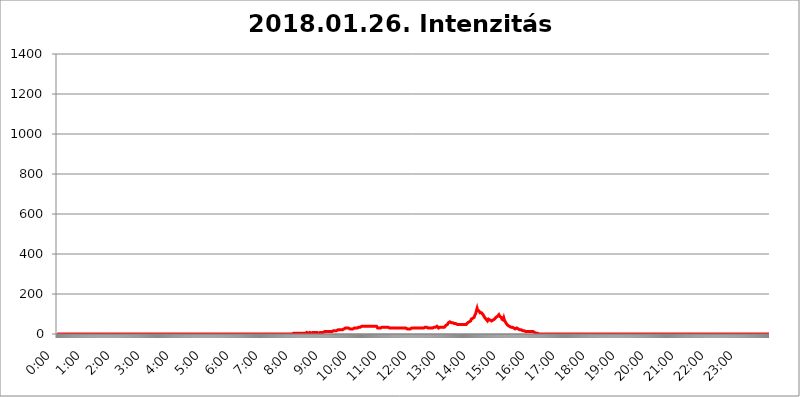
| Category | 2018.01.26. Intenzitás [W/m^2] |
|---|---|
| 0.0 | 0 |
| 0.0006944444444444445 | 0 |
| 0.001388888888888889 | 0 |
| 0.0020833333333333333 | 0 |
| 0.002777777777777778 | 0 |
| 0.003472222222222222 | 0 |
| 0.004166666666666667 | 0 |
| 0.004861111111111111 | 0 |
| 0.005555555555555556 | 0 |
| 0.0062499999999999995 | 0 |
| 0.006944444444444444 | 0 |
| 0.007638888888888889 | 0 |
| 0.008333333333333333 | 0 |
| 0.009027777777777779 | 0 |
| 0.009722222222222222 | 0 |
| 0.010416666666666666 | 0 |
| 0.011111111111111112 | 0 |
| 0.011805555555555555 | 0 |
| 0.012499999999999999 | 0 |
| 0.013194444444444444 | 0 |
| 0.013888888888888888 | 0 |
| 0.014583333333333332 | 0 |
| 0.015277777777777777 | 0 |
| 0.015972222222222224 | 0 |
| 0.016666666666666666 | 0 |
| 0.017361111111111112 | 0 |
| 0.018055555555555557 | 0 |
| 0.01875 | 0 |
| 0.019444444444444445 | 0 |
| 0.02013888888888889 | 0 |
| 0.020833333333333332 | 0 |
| 0.02152777777777778 | 0 |
| 0.022222222222222223 | 0 |
| 0.02291666666666667 | 0 |
| 0.02361111111111111 | 0 |
| 0.024305555555555556 | 0 |
| 0.024999999999999998 | 0 |
| 0.025694444444444447 | 0 |
| 0.02638888888888889 | 0 |
| 0.027083333333333334 | 0 |
| 0.027777777777777776 | 0 |
| 0.02847222222222222 | 0 |
| 0.029166666666666664 | 0 |
| 0.029861111111111113 | 0 |
| 0.030555555555555555 | 0 |
| 0.03125 | 0 |
| 0.03194444444444445 | 0 |
| 0.03263888888888889 | 0 |
| 0.03333333333333333 | 0 |
| 0.034027777777777775 | 0 |
| 0.034722222222222224 | 0 |
| 0.035416666666666666 | 0 |
| 0.036111111111111115 | 0 |
| 0.03680555555555556 | 0 |
| 0.0375 | 0 |
| 0.03819444444444444 | 0 |
| 0.03888888888888889 | 0 |
| 0.03958333333333333 | 0 |
| 0.04027777777777778 | 0 |
| 0.04097222222222222 | 0 |
| 0.041666666666666664 | 0 |
| 0.042361111111111106 | 0 |
| 0.04305555555555556 | 0 |
| 0.043750000000000004 | 0 |
| 0.044444444444444446 | 0 |
| 0.04513888888888889 | 0 |
| 0.04583333333333334 | 0 |
| 0.04652777777777778 | 0 |
| 0.04722222222222222 | 0 |
| 0.04791666666666666 | 0 |
| 0.04861111111111111 | 0 |
| 0.049305555555555554 | 0 |
| 0.049999999999999996 | 0 |
| 0.05069444444444445 | 0 |
| 0.051388888888888894 | 0 |
| 0.052083333333333336 | 0 |
| 0.05277777777777778 | 0 |
| 0.05347222222222222 | 0 |
| 0.05416666666666667 | 0 |
| 0.05486111111111111 | 0 |
| 0.05555555555555555 | 0 |
| 0.05625 | 0 |
| 0.05694444444444444 | 0 |
| 0.057638888888888885 | 0 |
| 0.05833333333333333 | 0 |
| 0.05902777777777778 | 0 |
| 0.059722222222222225 | 0 |
| 0.06041666666666667 | 0 |
| 0.061111111111111116 | 0 |
| 0.06180555555555556 | 0 |
| 0.0625 | 0 |
| 0.06319444444444444 | 0 |
| 0.06388888888888888 | 0 |
| 0.06458333333333334 | 0 |
| 0.06527777777777778 | 0 |
| 0.06597222222222222 | 0 |
| 0.06666666666666667 | 0 |
| 0.06736111111111111 | 0 |
| 0.06805555555555555 | 0 |
| 0.06874999999999999 | 0 |
| 0.06944444444444443 | 0 |
| 0.07013888888888889 | 0 |
| 0.07083333333333333 | 0 |
| 0.07152777777777779 | 0 |
| 0.07222222222222223 | 0 |
| 0.07291666666666667 | 0 |
| 0.07361111111111111 | 0 |
| 0.07430555555555556 | 0 |
| 0.075 | 0 |
| 0.07569444444444444 | 0 |
| 0.0763888888888889 | 0 |
| 0.07708333333333334 | 0 |
| 0.07777777777777778 | 0 |
| 0.07847222222222222 | 0 |
| 0.07916666666666666 | 0 |
| 0.0798611111111111 | 0 |
| 0.08055555555555556 | 0 |
| 0.08125 | 0 |
| 0.08194444444444444 | 0 |
| 0.08263888888888889 | 0 |
| 0.08333333333333333 | 0 |
| 0.08402777777777777 | 0 |
| 0.08472222222222221 | 0 |
| 0.08541666666666665 | 0 |
| 0.08611111111111112 | 0 |
| 0.08680555555555557 | 0 |
| 0.08750000000000001 | 0 |
| 0.08819444444444445 | 0 |
| 0.08888888888888889 | 0 |
| 0.08958333333333333 | 0 |
| 0.09027777777777778 | 0 |
| 0.09097222222222222 | 0 |
| 0.09166666666666667 | 0 |
| 0.09236111111111112 | 0 |
| 0.09305555555555556 | 0 |
| 0.09375 | 0 |
| 0.09444444444444444 | 0 |
| 0.09513888888888888 | 0 |
| 0.09583333333333333 | 0 |
| 0.09652777777777777 | 0 |
| 0.09722222222222222 | 0 |
| 0.09791666666666667 | 0 |
| 0.09861111111111111 | 0 |
| 0.09930555555555555 | 0 |
| 0.09999999999999999 | 0 |
| 0.10069444444444443 | 0 |
| 0.1013888888888889 | 0 |
| 0.10208333333333335 | 0 |
| 0.10277777777777779 | 0 |
| 0.10347222222222223 | 0 |
| 0.10416666666666667 | 0 |
| 0.10486111111111111 | 0 |
| 0.10555555555555556 | 0 |
| 0.10625 | 0 |
| 0.10694444444444444 | 0 |
| 0.1076388888888889 | 0 |
| 0.10833333333333334 | 0 |
| 0.10902777777777778 | 0 |
| 0.10972222222222222 | 0 |
| 0.1111111111111111 | 0 |
| 0.11180555555555556 | 0 |
| 0.11180555555555556 | 0 |
| 0.1125 | 0 |
| 0.11319444444444444 | 0 |
| 0.11388888888888889 | 0 |
| 0.11458333333333333 | 0 |
| 0.11527777777777777 | 0 |
| 0.11597222222222221 | 0 |
| 0.11666666666666665 | 0 |
| 0.1173611111111111 | 0 |
| 0.11805555555555557 | 0 |
| 0.11944444444444445 | 0 |
| 0.12013888888888889 | 0 |
| 0.12083333333333333 | 0 |
| 0.12152777777777778 | 0 |
| 0.12222222222222223 | 0 |
| 0.12291666666666667 | 0 |
| 0.12291666666666667 | 0 |
| 0.12361111111111112 | 0 |
| 0.12430555555555556 | 0 |
| 0.125 | 0 |
| 0.12569444444444444 | 0 |
| 0.12638888888888888 | 0 |
| 0.12708333333333333 | 0 |
| 0.16875 | 0 |
| 0.12847222222222224 | 0 |
| 0.12916666666666668 | 0 |
| 0.12986111111111112 | 0 |
| 0.13055555555555556 | 0 |
| 0.13125 | 0 |
| 0.13194444444444445 | 0 |
| 0.1326388888888889 | 0 |
| 0.13333333333333333 | 0 |
| 0.13402777777777777 | 0 |
| 0.13402777777777777 | 0 |
| 0.13472222222222222 | 0 |
| 0.13541666666666666 | 0 |
| 0.1361111111111111 | 0 |
| 0.13749999999999998 | 0 |
| 0.13819444444444443 | 0 |
| 0.1388888888888889 | 0 |
| 0.13958333333333334 | 0 |
| 0.14027777777777778 | 0 |
| 0.14097222222222222 | 0 |
| 0.14166666666666666 | 0 |
| 0.1423611111111111 | 0 |
| 0.14305555555555557 | 0 |
| 0.14375000000000002 | 0 |
| 0.14444444444444446 | 0 |
| 0.1451388888888889 | 0 |
| 0.1451388888888889 | 0 |
| 0.14652777777777778 | 0 |
| 0.14722222222222223 | 0 |
| 0.14791666666666667 | 0 |
| 0.1486111111111111 | 0 |
| 0.14930555555555555 | 0 |
| 0.15 | 0 |
| 0.15069444444444444 | 0 |
| 0.15138888888888888 | 0 |
| 0.15208333333333332 | 0 |
| 0.15277777777777776 | 0 |
| 0.15347222222222223 | 0 |
| 0.15416666666666667 | 0 |
| 0.15486111111111112 | 0 |
| 0.15555555555555556 | 0 |
| 0.15625 | 0 |
| 0.15694444444444444 | 0 |
| 0.15763888888888888 | 0 |
| 0.15833333333333333 | 0 |
| 0.15902777777777777 | 0 |
| 0.15972222222222224 | 0 |
| 0.16041666666666668 | 0 |
| 0.16111111111111112 | 0 |
| 0.16180555555555556 | 0 |
| 0.1625 | 0 |
| 0.16319444444444445 | 0 |
| 0.1638888888888889 | 0 |
| 0.16458333333333333 | 0 |
| 0.16527777777777777 | 0 |
| 0.16597222222222222 | 0 |
| 0.16666666666666666 | 0 |
| 0.1673611111111111 | 0 |
| 0.16805555555555554 | 0 |
| 0.16874999999999998 | 0 |
| 0.16944444444444443 | 0 |
| 0.17013888888888887 | 0 |
| 0.1708333333333333 | 0 |
| 0.17152777777777775 | 0 |
| 0.17222222222222225 | 0 |
| 0.1729166666666667 | 0 |
| 0.17361111111111113 | 0 |
| 0.17430555555555557 | 0 |
| 0.17500000000000002 | 0 |
| 0.17569444444444446 | 0 |
| 0.1763888888888889 | 0 |
| 0.17708333333333334 | 0 |
| 0.17777777777777778 | 0 |
| 0.17847222222222223 | 0 |
| 0.17916666666666667 | 0 |
| 0.1798611111111111 | 0 |
| 0.18055555555555555 | 0 |
| 0.18125 | 0 |
| 0.18194444444444444 | 0 |
| 0.1826388888888889 | 0 |
| 0.18333333333333335 | 0 |
| 0.1840277777777778 | 0 |
| 0.18472222222222223 | 0 |
| 0.18541666666666667 | 0 |
| 0.18611111111111112 | 0 |
| 0.18680555555555556 | 0 |
| 0.1875 | 0 |
| 0.18819444444444444 | 0 |
| 0.18888888888888888 | 0 |
| 0.18958333333333333 | 0 |
| 0.19027777777777777 | 0 |
| 0.1909722222222222 | 0 |
| 0.19166666666666665 | 0 |
| 0.19236111111111112 | 0 |
| 0.19305555555555554 | 0 |
| 0.19375 | 0 |
| 0.19444444444444445 | 0 |
| 0.1951388888888889 | 0 |
| 0.19583333333333333 | 0 |
| 0.19652777777777777 | 0 |
| 0.19722222222222222 | 0 |
| 0.19791666666666666 | 0 |
| 0.1986111111111111 | 0 |
| 0.19930555555555554 | 0 |
| 0.19999999999999998 | 0 |
| 0.20069444444444443 | 0 |
| 0.20138888888888887 | 0 |
| 0.2020833333333333 | 0 |
| 0.2027777777777778 | 0 |
| 0.2034722222222222 | 0 |
| 0.2041666666666667 | 0 |
| 0.20486111111111113 | 0 |
| 0.20555555555555557 | 0 |
| 0.20625000000000002 | 0 |
| 0.20694444444444446 | 0 |
| 0.2076388888888889 | 0 |
| 0.20833333333333334 | 0 |
| 0.20902777777777778 | 0 |
| 0.20972222222222223 | 0 |
| 0.21041666666666667 | 0 |
| 0.2111111111111111 | 0 |
| 0.21180555555555555 | 0 |
| 0.2125 | 0 |
| 0.21319444444444444 | 0 |
| 0.2138888888888889 | 0 |
| 0.21458333333333335 | 0 |
| 0.2152777777777778 | 0 |
| 0.21597222222222223 | 0 |
| 0.21666666666666667 | 0 |
| 0.21736111111111112 | 0 |
| 0.21805555555555556 | 0 |
| 0.21875 | 0 |
| 0.21944444444444444 | 0 |
| 0.22013888888888888 | 0 |
| 0.22083333333333333 | 0 |
| 0.22152777777777777 | 0 |
| 0.2222222222222222 | 0 |
| 0.22291666666666665 | 0 |
| 0.2236111111111111 | 0 |
| 0.22430555555555556 | 0 |
| 0.225 | 0 |
| 0.22569444444444445 | 0 |
| 0.2263888888888889 | 0 |
| 0.22708333333333333 | 0 |
| 0.22777777777777777 | 0 |
| 0.22847222222222222 | 0 |
| 0.22916666666666666 | 0 |
| 0.2298611111111111 | 0 |
| 0.23055555555555554 | 0 |
| 0.23124999999999998 | 0 |
| 0.23194444444444443 | 0 |
| 0.23263888888888887 | 0 |
| 0.2333333333333333 | 0 |
| 0.2340277777777778 | 0 |
| 0.2347222222222222 | 0 |
| 0.2354166666666667 | 0 |
| 0.23611111111111113 | 0 |
| 0.23680555555555557 | 0 |
| 0.23750000000000002 | 0 |
| 0.23819444444444446 | 0 |
| 0.2388888888888889 | 0 |
| 0.23958333333333334 | 0 |
| 0.24027777777777778 | 0 |
| 0.24097222222222223 | 0 |
| 0.24166666666666667 | 0 |
| 0.2423611111111111 | 0 |
| 0.24305555555555555 | 0 |
| 0.24375 | 0 |
| 0.24444444444444446 | 0 |
| 0.24513888888888888 | 0 |
| 0.24583333333333335 | 0 |
| 0.2465277777777778 | 0 |
| 0.24722222222222223 | 0 |
| 0.24791666666666667 | 0 |
| 0.24861111111111112 | 0 |
| 0.24930555555555556 | 0 |
| 0.25 | 0 |
| 0.25069444444444444 | 0 |
| 0.2513888888888889 | 0 |
| 0.2520833333333333 | 0 |
| 0.25277777777777777 | 0 |
| 0.2534722222222222 | 0 |
| 0.25416666666666665 | 0 |
| 0.2548611111111111 | 0 |
| 0.2555555555555556 | 0 |
| 0.25625000000000003 | 0 |
| 0.2569444444444445 | 0 |
| 0.2576388888888889 | 0 |
| 0.25833333333333336 | 0 |
| 0.2590277777777778 | 0 |
| 0.25972222222222224 | 0 |
| 0.2604166666666667 | 0 |
| 0.2611111111111111 | 0 |
| 0.26180555555555557 | 0 |
| 0.2625 | 0 |
| 0.26319444444444445 | 0 |
| 0.2638888888888889 | 0 |
| 0.26458333333333334 | 0 |
| 0.2652777777777778 | 0 |
| 0.2659722222222222 | 0 |
| 0.26666666666666666 | 0 |
| 0.2673611111111111 | 0 |
| 0.26805555555555555 | 0 |
| 0.26875 | 0 |
| 0.26944444444444443 | 0 |
| 0.2701388888888889 | 0 |
| 0.2708333333333333 | 0 |
| 0.27152777777777776 | 0 |
| 0.2722222222222222 | 0 |
| 0.27291666666666664 | 0 |
| 0.2736111111111111 | 0 |
| 0.2743055555555555 | 0 |
| 0.27499999999999997 | 0 |
| 0.27569444444444446 | 0 |
| 0.27638888888888885 | 0 |
| 0.27708333333333335 | 0 |
| 0.2777777777777778 | 0 |
| 0.27847222222222223 | 0 |
| 0.2791666666666667 | 0 |
| 0.2798611111111111 | 0 |
| 0.28055555555555556 | 0 |
| 0.28125 | 0 |
| 0.28194444444444444 | 0 |
| 0.2826388888888889 | 0 |
| 0.2833333333333333 | 0 |
| 0.28402777777777777 | 0 |
| 0.2847222222222222 | 0 |
| 0.28541666666666665 | 0 |
| 0.28611111111111115 | 0 |
| 0.28680555555555554 | 0 |
| 0.28750000000000003 | 0 |
| 0.2881944444444445 | 0 |
| 0.2888888888888889 | 0 |
| 0.28958333333333336 | 0 |
| 0.2902777777777778 | 0 |
| 0.29097222222222224 | 0 |
| 0.2916666666666667 | 0 |
| 0.2923611111111111 | 0 |
| 0.29305555555555557 | 0 |
| 0.29375 | 0 |
| 0.29444444444444445 | 0 |
| 0.2951388888888889 | 0 |
| 0.29583333333333334 | 0 |
| 0.2965277777777778 | 0 |
| 0.2972222222222222 | 0 |
| 0.29791666666666666 | 0 |
| 0.2986111111111111 | 0 |
| 0.29930555555555555 | 0 |
| 0.3 | 0 |
| 0.30069444444444443 | 0 |
| 0.3013888888888889 | 0 |
| 0.3020833333333333 | 0 |
| 0.30277777777777776 | 0 |
| 0.3034722222222222 | 0 |
| 0.30416666666666664 | 0 |
| 0.3048611111111111 | 0 |
| 0.3055555555555555 | 0 |
| 0.30624999999999997 | 0 |
| 0.3069444444444444 | 0 |
| 0.3076388888888889 | 0 |
| 0.30833333333333335 | 0 |
| 0.3090277777777778 | 0 |
| 0.30972222222222223 | 0 |
| 0.3104166666666667 | 0 |
| 0.3111111111111111 | 0 |
| 0.31180555555555556 | 0 |
| 0.3125 | 0 |
| 0.31319444444444444 | 0 |
| 0.3138888888888889 | 0 |
| 0.3145833333333333 | 0 |
| 0.31527777777777777 | 0 |
| 0.3159722222222222 | 0 |
| 0.31666666666666665 | 0 |
| 0.31736111111111115 | 0 |
| 0.31805555555555554 | 0 |
| 0.31875000000000003 | 0 |
| 0.3194444444444445 | 0 |
| 0.3201388888888889 | 3.525 |
| 0.32083333333333336 | 0 |
| 0.3215277777777778 | 0 |
| 0.32222222222222224 | 0 |
| 0.3229166666666667 | 0 |
| 0.3236111111111111 | 0 |
| 0.32430555555555557 | 0 |
| 0.325 | 0 |
| 0.32569444444444445 | 0 |
| 0.3263888888888889 | 0 |
| 0.32708333333333334 | 0 |
| 0.3277777777777778 | 0 |
| 0.3284722222222222 | 0 |
| 0.32916666666666666 | 0 |
| 0.3298611111111111 | 3.525 |
| 0.33055555555555555 | 3.525 |
| 0.33125 | 3.525 |
| 0.33194444444444443 | 3.525 |
| 0.3326388888888889 | 3.525 |
| 0.3333333333333333 | 3.525 |
| 0.3340277777777778 | 3.525 |
| 0.3347222222222222 | 3.525 |
| 0.3354166666666667 | 3.525 |
| 0.3361111111111111 | 3.525 |
| 0.3368055555555556 | 3.525 |
| 0.33749999999999997 | 3.525 |
| 0.33819444444444446 | 3.525 |
| 0.33888888888888885 | 3.525 |
| 0.33958333333333335 | 3.525 |
| 0.34027777777777773 | 3.525 |
| 0.34097222222222223 | 3.525 |
| 0.3416666666666666 | 3.525 |
| 0.3423611111111111 | 3.525 |
| 0.3430555555555555 | 3.525 |
| 0.34375 | 3.525 |
| 0.3444444444444445 | 3.525 |
| 0.3451388888888889 | 3.525 |
| 0.3458333333333334 | 3.525 |
| 0.34652777777777777 | 3.525 |
| 0.34722222222222227 | 3.525 |
| 0.34791666666666665 | 3.525 |
| 0.34861111111111115 | 3.525 |
| 0.34930555555555554 | 3.525 |
| 0.35000000000000003 | 7.887 |
| 0.3506944444444444 | 7.887 |
| 0.3513888888888889 | 7.887 |
| 0.3520833333333333 | 3.525 |
| 0.3527777777777778 | 7.887 |
| 0.3534722222222222 | 3.525 |
| 0.3541666666666667 | 7.887 |
| 0.3548611111111111 | 3.525 |
| 0.35555555555555557 | 3.525 |
| 0.35625 | 3.525 |
| 0.35694444444444445 | 7.887 |
| 0.3576388888888889 | 7.887 |
| 0.35833333333333334 | 7.887 |
| 0.3590277777777778 | 7.887 |
| 0.3597222222222222 | 7.887 |
| 0.36041666666666666 | 7.887 |
| 0.3611111111111111 | 7.887 |
| 0.36180555555555555 | 7.887 |
| 0.3625 | 7.887 |
| 0.36319444444444443 | 7.887 |
| 0.3638888888888889 | 7.887 |
| 0.3645833333333333 | 7.887 |
| 0.3652777777777778 | 7.887 |
| 0.3659722222222222 | 3.525 |
| 0.3666666666666667 | 3.525 |
| 0.3673611111111111 | 3.525 |
| 0.3680555555555556 | 3.525 |
| 0.36874999999999997 | 7.887 |
| 0.36944444444444446 | 7.887 |
| 0.37013888888888885 | 7.887 |
| 0.37083333333333335 | 7.887 |
| 0.37152777777777773 | 7.887 |
| 0.37222222222222223 | 7.887 |
| 0.3729166666666666 | 7.887 |
| 0.3736111111111111 | 7.887 |
| 0.3743055555555555 | 12.257 |
| 0.375 | 12.257 |
| 0.3756944444444445 | 12.257 |
| 0.3763888888888889 | 12.257 |
| 0.3770833333333334 | 12.257 |
| 0.37777777777777777 | 12.257 |
| 0.37847222222222227 | 12.257 |
| 0.37916666666666665 | 12.257 |
| 0.37986111111111115 | 12.257 |
| 0.38055555555555554 | 12.257 |
| 0.38125000000000003 | 12.257 |
| 0.3819444444444444 | 12.257 |
| 0.3826388888888889 | 12.257 |
| 0.3833333333333333 | 12.257 |
| 0.3840277777777778 | 12.257 |
| 0.3847222222222222 | 12.257 |
| 0.3854166666666667 | 12.257 |
| 0.3861111111111111 | 12.257 |
| 0.38680555555555557 | 12.257 |
| 0.3875 | 16.636 |
| 0.38819444444444445 | 16.636 |
| 0.3888888888888889 | 16.636 |
| 0.38958333333333334 | 16.636 |
| 0.3902777777777778 | 16.636 |
| 0.3909722222222222 | 16.636 |
| 0.39166666666666666 | 16.636 |
| 0.3923611111111111 | 16.636 |
| 0.39305555555555555 | 16.636 |
| 0.39375 | 21.024 |
| 0.39444444444444443 | 21.024 |
| 0.3951388888888889 | 21.024 |
| 0.3958333333333333 | 21.024 |
| 0.3965277777777778 | 21.024 |
| 0.3972222222222222 | 21.024 |
| 0.3979166666666667 | 21.024 |
| 0.3986111111111111 | 21.024 |
| 0.3993055555555556 | 21.024 |
| 0.39999999999999997 | 21.024 |
| 0.40069444444444446 | 21.024 |
| 0.40138888888888885 | 25.419 |
| 0.40208333333333335 | 25.419 |
| 0.40277777777777773 | 29.823 |
| 0.40347222222222223 | 29.823 |
| 0.4041666666666666 | 29.823 |
| 0.4048611111111111 | 29.823 |
| 0.4055555555555555 | 29.823 |
| 0.40625 | 29.823 |
| 0.4069444444444445 | 29.823 |
| 0.4076388888888889 | 29.823 |
| 0.4083333333333334 | 29.823 |
| 0.40902777777777777 | 25.419 |
| 0.40972222222222227 | 25.419 |
| 0.41041666666666665 | 25.419 |
| 0.41111111111111115 | 25.419 |
| 0.41180555555555554 | 25.419 |
| 0.41250000000000003 | 25.419 |
| 0.4131944444444444 | 25.419 |
| 0.4138888888888889 | 25.419 |
| 0.4145833333333333 | 25.419 |
| 0.4152777777777778 | 25.419 |
| 0.4159722222222222 | 25.419 |
| 0.4166666666666667 | 29.823 |
| 0.4173611111111111 | 29.823 |
| 0.41805555555555557 | 29.823 |
| 0.41875 | 29.823 |
| 0.41944444444444445 | 29.823 |
| 0.4201388888888889 | 29.823 |
| 0.42083333333333334 | 29.823 |
| 0.4215277777777778 | 29.823 |
| 0.4222222222222222 | 34.234 |
| 0.42291666666666666 | 34.234 |
| 0.4236111111111111 | 34.234 |
| 0.42430555555555555 | 34.234 |
| 0.425 | 34.234 |
| 0.42569444444444443 | 38.653 |
| 0.4263888888888889 | 38.653 |
| 0.4270833333333333 | 38.653 |
| 0.4277777777777778 | 38.653 |
| 0.4284722222222222 | 38.653 |
| 0.4291666666666667 | 38.653 |
| 0.4298611111111111 | 38.653 |
| 0.4305555555555556 | 38.653 |
| 0.43124999999999997 | 38.653 |
| 0.43194444444444446 | 38.653 |
| 0.43263888888888885 | 38.653 |
| 0.43333333333333335 | 38.653 |
| 0.43402777777777773 | 38.653 |
| 0.43472222222222223 | 38.653 |
| 0.4354166666666666 | 38.653 |
| 0.4361111111111111 | 38.653 |
| 0.4368055555555555 | 38.653 |
| 0.4375 | 38.653 |
| 0.4381944444444445 | 38.653 |
| 0.4388888888888889 | 38.653 |
| 0.4395833333333334 | 38.653 |
| 0.44027777777777777 | 38.653 |
| 0.44097222222222227 | 38.653 |
| 0.44166666666666665 | 38.653 |
| 0.44236111111111115 | 38.653 |
| 0.44305555555555554 | 38.653 |
| 0.44375000000000003 | 38.653 |
| 0.4444444444444444 | 38.653 |
| 0.4451388888888889 | 38.653 |
| 0.4458333333333333 | 38.653 |
| 0.4465277777777778 | 38.653 |
| 0.4472222222222222 | 38.653 |
| 0.4479166666666667 | 38.653 |
| 0.4486111111111111 | 38.653 |
| 0.44930555555555557 | 29.823 |
| 0.45 | 29.823 |
| 0.45069444444444445 | 29.823 |
| 0.4513888888888889 | 29.823 |
| 0.45208333333333334 | 34.234 |
| 0.4527777777777778 | 34.234 |
| 0.4534722222222222 | 29.823 |
| 0.45416666666666666 | 34.234 |
| 0.4548611111111111 | 34.234 |
| 0.45555555555555555 | 34.234 |
| 0.45625 | 34.234 |
| 0.45694444444444443 | 34.234 |
| 0.4576388888888889 | 34.234 |
| 0.4583333333333333 | 34.234 |
| 0.4590277777777778 | 34.234 |
| 0.4597222222222222 | 34.234 |
| 0.4604166666666667 | 34.234 |
| 0.4611111111111111 | 34.234 |
| 0.4618055555555556 | 34.234 |
| 0.46249999999999997 | 34.234 |
| 0.46319444444444446 | 34.234 |
| 0.46388888888888885 | 34.234 |
| 0.46458333333333335 | 34.234 |
| 0.46527777777777773 | 29.823 |
| 0.46597222222222223 | 29.823 |
| 0.4666666666666666 | 29.823 |
| 0.4673611111111111 | 29.823 |
| 0.4680555555555555 | 29.823 |
| 0.46875 | 29.823 |
| 0.4694444444444445 | 29.823 |
| 0.4701388888888889 | 29.823 |
| 0.4708333333333334 | 29.823 |
| 0.47152777777777777 | 29.823 |
| 0.47222222222222227 | 29.823 |
| 0.47291666666666665 | 29.823 |
| 0.47361111111111115 | 29.823 |
| 0.47430555555555554 | 29.823 |
| 0.47500000000000003 | 29.823 |
| 0.4756944444444444 | 29.823 |
| 0.4763888888888889 | 29.823 |
| 0.4770833333333333 | 29.823 |
| 0.4777777777777778 | 29.823 |
| 0.4784722222222222 | 29.823 |
| 0.4791666666666667 | 29.823 |
| 0.4798611111111111 | 29.823 |
| 0.48055555555555557 | 29.823 |
| 0.48125 | 29.823 |
| 0.48194444444444445 | 29.823 |
| 0.4826388888888889 | 29.823 |
| 0.48333333333333334 | 29.823 |
| 0.4840277777777778 | 29.823 |
| 0.4847222222222222 | 29.823 |
| 0.48541666666666666 | 29.823 |
| 0.4861111111111111 | 29.823 |
| 0.48680555555555555 | 29.823 |
| 0.4875 | 29.823 |
| 0.48819444444444443 | 29.823 |
| 0.4888888888888889 | 29.823 |
| 0.4895833333333333 | 29.823 |
| 0.4902777777777778 | 29.823 |
| 0.4909722222222222 | 25.419 |
| 0.4916666666666667 | 25.419 |
| 0.4923611111111111 | 25.419 |
| 0.4930555555555556 | 25.419 |
| 0.49374999999999997 | 25.419 |
| 0.49444444444444446 | 25.419 |
| 0.49513888888888885 | 25.419 |
| 0.49583333333333335 | 29.823 |
| 0.49652777777777773 | 29.823 |
| 0.49722222222222223 | 29.823 |
| 0.4979166666666666 | 29.823 |
| 0.4986111111111111 | 29.823 |
| 0.4993055555555555 | 29.823 |
| 0.5 | 29.823 |
| 0.5006944444444444 | 29.823 |
| 0.5013888888888889 | 29.823 |
| 0.5020833333333333 | 29.823 |
| 0.5027777777777778 | 29.823 |
| 0.5034722222222222 | 29.823 |
| 0.5041666666666667 | 29.823 |
| 0.5048611111111111 | 29.823 |
| 0.5055555555555555 | 29.823 |
| 0.50625 | 29.823 |
| 0.5069444444444444 | 29.823 |
| 0.5076388888888889 | 29.823 |
| 0.5083333333333333 | 29.823 |
| 0.5090277777777777 | 29.823 |
| 0.5097222222222222 | 29.823 |
| 0.5104166666666666 | 29.823 |
| 0.5111111111111112 | 29.823 |
| 0.5118055555555555 | 29.823 |
| 0.5125000000000001 | 29.823 |
| 0.5131944444444444 | 29.823 |
| 0.513888888888889 | 29.823 |
| 0.5145833333333333 | 34.234 |
| 0.5152777777777778 | 34.234 |
| 0.5159722222222222 | 34.234 |
| 0.5166666666666667 | 29.823 |
| 0.517361111111111 | 34.234 |
| 0.5180555555555556 | 34.234 |
| 0.5187499999999999 | 34.234 |
| 0.5194444444444445 | 29.823 |
| 0.5201388888888888 | 29.823 |
| 0.5208333333333334 | 29.823 |
| 0.5215277777777778 | 29.823 |
| 0.5222222222222223 | 29.823 |
| 0.5229166666666667 | 29.823 |
| 0.5236111111111111 | 29.823 |
| 0.5243055555555556 | 29.823 |
| 0.525 | 29.823 |
| 0.5256944444444445 | 29.823 |
| 0.5263888888888889 | 29.823 |
| 0.5270833333333333 | 29.823 |
| 0.5277777777777778 | 34.234 |
| 0.5284722222222222 | 34.234 |
| 0.5291666666666667 | 34.234 |
| 0.5298611111111111 | 34.234 |
| 0.5305555555555556 | 34.234 |
| 0.53125 | 38.653 |
| 0.5319444444444444 | 38.653 |
| 0.5326388888888889 | 38.653 |
| 0.5333333333333333 | 34.234 |
| 0.5340277777777778 | 34.234 |
| 0.5347222222222222 | 29.823 |
| 0.5354166666666667 | 34.234 |
| 0.5361111111111111 | 34.234 |
| 0.5368055555555555 | 34.234 |
| 0.5375 | 34.234 |
| 0.5381944444444444 | 34.234 |
| 0.5388888888888889 | 34.234 |
| 0.5395833333333333 | 34.234 |
| 0.5402777777777777 | 34.234 |
| 0.5409722222222222 | 34.234 |
| 0.5416666666666666 | 34.234 |
| 0.5423611111111112 | 34.234 |
| 0.5430555555555555 | 34.234 |
| 0.5437500000000001 | 38.653 |
| 0.5444444444444444 | 38.653 |
| 0.545138888888889 | 43.079 |
| 0.5458333333333333 | 43.079 |
| 0.5465277777777778 | 47.511 |
| 0.5472222222222222 | 47.511 |
| 0.5479166666666667 | 51.951 |
| 0.548611111111111 | 56.398 |
| 0.5493055555555556 | 60.85 |
| 0.5499999999999999 | 60.85 |
| 0.5506944444444445 | 60.85 |
| 0.5513888888888888 | 60.85 |
| 0.5520833333333334 | 60.85 |
| 0.5527777777777778 | 56.398 |
| 0.5534722222222223 | 51.951 |
| 0.5541666666666667 | 56.398 |
| 0.5548611111111111 | 56.398 |
| 0.5555555555555556 | 56.398 |
| 0.55625 | 56.398 |
| 0.5569444444444445 | 51.951 |
| 0.5576388888888889 | 56.398 |
| 0.5583333333333333 | 56.398 |
| 0.5590277777777778 | 51.951 |
| 0.5597222222222222 | 51.951 |
| 0.5604166666666667 | 51.951 |
| 0.5611111111111111 | 47.511 |
| 0.5618055555555556 | 47.511 |
| 0.5625 | 47.511 |
| 0.5631944444444444 | 47.511 |
| 0.5638888888888889 | 47.511 |
| 0.5645833333333333 | 47.511 |
| 0.5652777777777778 | 47.511 |
| 0.5659722222222222 | 47.511 |
| 0.5666666666666667 | 47.511 |
| 0.5673611111111111 | 47.511 |
| 0.5680555555555555 | 47.511 |
| 0.56875 | 47.511 |
| 0.5694444444444444 | 47.511 |
| 0.5701388888888889 | 47.511 |
| 0.5708333333333333 | 47.511 |
| 0.5715277777777777 | 47.511 |
| 0.5722222222222222 | 47.511 |
| 0.5729166666666666 | 47.511 |
| 0.5736111111111112 | 47.511 |
| 0.5743055555555555 | 51.951 |
| 0.5750000000000001 | 51.951 |
| 0.5756944444444444 | 56.398 |
| 0.576388888888889 | 56.398 |
| 0.5770833333333333 | 60.85 |
| 0.5777777777777778 | 60.85 |
| 0.5784722222222222 | 65.31 |
| 0.5791666666666667 | 65.31 |
| 0.579861111111111 | 65.31 |
| 0.5805555555555556 | 74.246 |
| 0.5812499999999999 | 78.722 |
| 0.5819444444444445 | 78.722 |
| 0.5826388888888888 | 78.722 |
| 0.5833333333333334 | 78.722 |
| 0.5840277777777778 | 78.722 |
| 0.5847222222222223 | 83.205 |
| 0.5854166666666667 | 92.184 |
| 0.5861111111111111 | 92.184 |
| 0.5868055555555556 | 101.184 |
| 0.5875 | 110.201 |
| 0.5881944444444445 | 119.235 |
| 0.5888888888888889 | 128.284 |
| 0.5895833333333333 | 119.235 |
| 0.5902777777777778 | 114.716 |
| 0.5909722222222222 | 119.235 |
| 0.5916666666666667 | 114.716 |
| 0.5923611111111111 | 110.201 |
| 0.5930555555555556 | 105.69 |
| 0.59375 | 105.69 |
| 0.5944444444444444 | 105.69 |
| 0.5951388888888889 | 105.69 |
| 0.5958333333333333 | 105.69 |
| 0.5965277777777778 | 101.184 |
| 0.5972222222222222 | 96.682 |
| 0.5979166666666667 | 92.184 |
| 0.5986111111111111 | 92.184 |
| 0.5993055555555555 | 83.205 |
| 0.6 | 83.205 |
| 0.6006944444444444 | 78.722 |
| 0.6013888888888889 | 74.246 |
| 0.6020833333333333 | 69.775 |
| 0.6027777777777777 | 69.775 |
| 0.6034722222222222 | 65.31 |
| 0.6041666666666666 | 69.775 |
| 0.6048611111111112 | 74.246 |
| 0.6055555555555555 | 78.722 |
| 0.6062500000000001 | 74.246 |
| 0.6069444444444444 | 69.775 |
| 0.607638888888889 | 65.31 |
| 0.6083333333333333 | 65.31 |
| 0.6090277777777778 | 65.31 |
| 0.6097222222222222 | 65.31 |
| 0.6104166666666667 | 65.31 |
| 0.611111111111111 | 69.775 |
| 0.6118055555555556 | 69.775 |
| 0.6124999999999999 | 69.775 |
| 0.6131944444444445 | 74.246 |
| 0.6138888888888888 | 74.246 |
| 0.6145833333333334 | 78.722 |
| 0.6152777777777778 | 83.205 |
| 0.6159722222222223 | 83.205 |
| 0.6166666666666667 | 83.205 |
| 0.6173611111111111 | 87.692 |
| 0.6180555555555556 | 92.184 |
| 0.61875 | 92.184 |
| 0.6194444444444445 | 96.682 |
| 0.6201388888888889 | 96.682 |
| 0.6208333333333333 | 87.692 |
| 0.6215277777777778 | 83.205 |
| 0.6222222222222222 | 83.205 |
| 0.6229166666666667 | 83.205 |
| 0.6236111111111111 | 74.246 |
| 0.6243055555555556 | 74.246 |
| 0.625 | 69.775 |
| 0.6256944444444444 | 69.775 |
| 0.6263888888888889 | 78.722 |
| 0.6270833333333333 | 69.775 |
| 0.6277777777777778 | 65.31 |
| 0.6284722222222222 | 60.85 |
| 0.6291666666666667 | 56.398 |
| 0.6298611111111111 | 51.951 |
| 0.6305555555555555 | 51.951 |
| 0.63125 | 47.511 |
| 0.6319444444444444 | 43.079 |
| 0.6326388888888889 | 43.079 |
| 0.6333333333333333 | 38.653 |
| 0.6340277777777777 | 38.653 |
| 0.6347222222222222 | 38.653 |
| 0.6354166666666666 | 38.653 |
| 0.6361111111111112 | 34.234 |
| 0.6368055555555555 | 38.653 |
| 0.6375000000000001 | 34.234 |
| 0.6381944444444444 | 34.234 |
| 0.638888888888889 | 34.234 |
| 0.6395833333333333 | 29.823 |
| 0.6402777777777778 | 29.823 |
| 0.6409722222222222 | 29.823 |
| 0.6416666666666667 | 29.823 |
| 0.642361111111111 | 25.419 |
| 0.6430555555555556 | 25.419 |
| 0.6437499999999999 | 25.419 |
| 0.6444444444444445 | 29.823 |
| 0.6451388888888888 | 29.823 |
| 0.6458333333333334 | 29.823 |
| 0.6465277777777778 | 25.419 |
| 0.6472222222222223 | 25.419 |
| 0.6479166666666667 | 21.024 |
| 0.6486111111111111 | 21.024 |
| 0.6493055555555556 | 21.024 |
| 0.65 | 21.024 |
| 0.6506944444444445 | 21.024 |
| 0.6513888888888889 | 21.024 |
| 0.6520833333333333 | 16.636 |
| 0.6527777777777778 | 16.636 |
| 0.6534722222222222 | 16.636 |
| 0.6541666666666667 | 16.636 |
| 0.6548611111111111 | 16.636 |
| 0.6555555555555556 | 12.257 |
| 0.65625 | 12.257 |
| 0.6569444444444444 | 12.257 |
| 0.6576388888888889 | 12.257 |
| 0.6583333333333333 | 12.257 |
| 0.6590277777777778 | 12.257 |
| 0.6597222222222222 | 12.257 |
| 0.6604166666666667 | 12.257 |
| 0.6611111111111111 | 12.257 |
| 0.6618055555555555 | 12.257 |
| 0.6625 | 12.257 |
| 0.6631944444444444 | 12.257 |
| 0.6638888888888889 | 12.257 |
| 0.6645833333333333 | 12.257 |
| 0.6652777777777777 | 12.257 |
| 0.6659722222222222 | 12.257 |
| 0.6666666666666666 | 12.257 |
| 0.6673611111111111 | 12.257 |
| 0.6680555555555556 | 7.887 |
| 0.6687500000000001 | 7.887 |
| 0.6694444444444444 | 7.887 |
| 0.6701388888888888 | 3.525 |
| 0.6708333333333334 | 3.525 |
| 0.6715277777777778 | 3.525 |
| 0.6722222222222222 | 3.525 |
| 0.6729166666666666 | 3.525 |
| 0.6736111111111112 | 3.525 |
| 0.6743055555555556 | 3.525 |
| 0.6749999999999999 | 3.525 |
| 0.6756944444444444 | 0 |
| 0.6763888888888889 | 0 |
| 0.6770833333333334 | 0 |
| 0.6777777777777777 | 0 |
| 0.6784722222222223 | 0 |
| 0.6791666666666667 | 0 |
| 0.6798611111111111 | 0 |
| 0.6805555555555555 | 0 |
| 0.68125 | 0 |
| 0.6819444444444445 | 0 |
| 0.6826388888888889 | 0 |
| 0.6833333333333332 | 0 |
| 0.6840277777777778 | 0 |
| 0.6847222222222222 | 0 |
| 0.6854166666666667 | 0 |
| 0.686111111111111 | 0 |
| 0.6868055555555556 | 0 |
| 0.6875 | 0 |
| 0.6881944444444444 | 0 |
| 0.688888888888889 | 0 |
| 0.6895833333333333 | 0 |
| 0.6902777777777778 | 0 |
| 0.6909722222222222 | 0 |
| 0.6916666666666668 | 0 |
| 0.6923611111111111 | 0 |
| 0.6930555555555555 | 0 |
| 0.69375 | 0 |
| 0.6944444444444445 | 0 |
| 0.6951388888888889 | 0 |
| 0.6958333333333333 | 0 |
| 0.6965277777777777 | 0 |
| 0.6972222222222223 | 0 |
| 0.6979166666666666 | 0 |
| 0.6986111111111111 | 0 |
| 0.6993055555555556 | 0 |
| 0.7000000000000001 | 0 |
| 0.7006944444444444 | 0 |
| 0.7013888888888888 | 0 |
| 0.7020833333333334 | 0 |
| 0.7027777777777778 | 0 |
| 0.7034722222222222 | 0 |
| 0.7041666666666666 | 0 |
| 0.7048611111111112 | 0 |
| 0.7055555555555556 | 0 |
| 0.7062499999999999 | 0 |
| 0.7069444444444444 | 0 |
| 0.7076388888888889 | 0 |
| 0.7083333333333334 | 0 |
| 0.7090277777777777 | 0 |
| 0.7097222222222223 | 0 |
| 0.7104166666666667 | 0 |
| 0.7111111111111111 | 0 |
| 0.7118055555555555 | 0 |
| 0.7125 | 0 |
| 0.7131944444444445 | 0 |
| 0.7138888888888889 | 0 |
| 0.7145833333333332 | 0 |
| 0.7152777777777778 | 0 |
| 0.7159722222222222 | 0 |
| 0.7166666666666667 | 0 |
| 0.717361111111111 | 0 |
| 0.7180555555555556 | 0 |
| 0.71875 | 0 |
| 0.7194444444444444 | 0 |
| 0.720138888888889 | 0 |
| 0.7208333333333333 | 0 |
| 0.7215277777777778 | 0 |
| 0.7222222222222222 | 0 |
| 0.7229166666666668 | 0 |
| 0.7236111111111111 | 0 |
| 0.7243055555555555 | 0 |
| 0.725 | 0 |
| 0.7256944444444445 | 0 |
| 0.7263888888888889 | 0 |
| 0.7270833333333333 | 0 |
| 0.7277777777777777 | 0 |
| 0.7284722222222223 | 0 |
| 0.7291666666666666 | 0 |
| 0.7298611111111111 | 0 |
| 0.7305555555555556 | 0 |
| 0.7312500000000001 | 0 |
| 0.7319444444444444 | 0 |
| 0.7326388888888888 | 0 |
| 0.7333333333333334 | 0 |
| 0.7340277777777778 | 0 |
| 0.7347222222222222 | 0 |
| 0.7354166666666666 | 0 |
| 0.7361111111111112 | 0 |
| 0.7368055555555556 | 0 |
| 0.7374999999999999 | 0 |
| 0.7381944444444444 | 0 |
| 0.7388888888888889 | 0 |
| 0.7395833333333334 | 0 |
| 0.7402777777777777 | 0 |
| 0.7409722222222223 | 0 |
| 0.7416666666666667 | 0 |
| 0.7423611111111111 | 0 |
| 0.7430555555555555 | 0 |
| 0.74375 | 0 |
| 0.7444444444444445 | 0 |
| 0.7451388888888889 | 0 |
| 0.7458333333333332 | 0 |
| 0.7465277777777778 | 0 |
| 0.7472222222222222 | 0 |
| 0.7479166666666667 | 0 |
| 0.748611111111111 | 0 |
| 0.7493055555555556 | 0 |
| 0.75 | 0 |
| 0.7506944444444444 | 0 |
| 0.751388888888889 | 0 |
| 0.7520833333333333 | 0 |
| 0.7527777777777778 | 0 |
| 0.7534722222222222 | 0 |
| 0.7541666666666668 | 0 |
| 0.7548611111111111 | 0 |
| 0.7555555555555555 | 0 |
| 0.75625 | 0 |
| 0.7569444444444445 | 0 |
| 0.7576388888888889 | 0 |
| 0.7583333333333333 | 0 |
| 0.7590277777777777 | 0 |
| 0.7597222222222223 | 0 |
| 0.7604166666666666 | 0 |
| 0.7611111111111111 | 0 |
| 0.7618055555555556 | 0 |
| 0.7625000000000001 | 0 |
| 0.7631944444444444 | 0 |
| 0.7638888888888888 | 0 |
| 0.7645833333333334 | 0 |
| 0.7652777777777778 | 0 |
| 0.7659722222222222 | 0 |
| 0.7666666666666666 | 0 |
| 0.7673611111111112 | 0 |
| 0.7680555555555556 | 0 |
| 0.7687499999999999 | 0 |
| 0.7694444444444444 | 0 |
| 0.7701388888888889 | 0 |
| 0.7708333333333334 | 0 |
| 0.7715277777777777 | 0 |
| 0.7722222222222223 | 0 |
| 0.7729166666666667 | 0 |
| 0.7736111111111111 | 0 |
| 0.7743055555555555 | 0 |
| 0.775 | 0 |
| 0.7756944444444445 | 0 |
| 0.7763888888888889 | 0 |
| 0.7770833333333332 | 0 |
| 0.7777777777777778 | 0 |
| 0.7784722222222222 | 0 |
| 0.7791666666666667 | 0 |
| 0.779861111111111 | 0 |
| 0.7805555555555556 | 0 |
| 0.78125 | 0 |
| 0.7819444444444444 | 0 |
| 0.782638888888889 | 0 |
| 0.7833333333333333 | 0 |
| 0.7840277777777778 | 0 |
| 0.7847222222222222 | 0 |
| 0.7854166666666668 | 0 |
| 0.7861111111111111 | 0 |
| 0.7868055555555555 | 0 |
| 0.7875 | 0 |
| 0.7881944444444445 | 0 |
| 0.7888888888888889 | 0 |
| 0.7895833333333333 | 0 |
| 0.7902777777777777 | 0 |
| 0.7909722222222223 | 0 |
| 0.7916666666666666 | 0 |
| 0.7923611111111111 | 0 |
| 0.7930555555555556 | 0 |
| 0.7937500000000001 | 0 |
| 0.7944444444444444 | 0 |
| 0.7951388888888888 | 0 |
| 0.7958333333333334 | 0 |
| 0.7965277777777778 | 0 |
| 0.7972222222222222 | 0 |
| 0.7979166666666666 | 0 |
| 0.7986111111111112 | 0 |
| 0.7993055555555556 | 0 |
| 0.7999999999999999 | 0 |
| 0.8006944444444444 | 0 |
| 0.8013888888888889 | 0 |
| 0.8020833333333334 | 0 |
| 0.8027777777777777 | 0 |
| 0.8034722222222223 | 0 |
| 0.8041666666666667 | 0 |
| 0.8048611111111111 | 0 |
| 0.8055555555555555 | 0 |
| 0.80625 | 0 |
| 0.8069444444444445 | 0 |
| 0.8076388888888889 | 0 |
| 0.8083333333333332 | 0 |
| 0.8090277777777778 | 0 |
| 0.8097222222222222 | 0 |
| 0.8104166666666667 | 0 |
| 0.811111111111111 | 0 |
| 0.8118055555555556 | 0 |
| 0.8125 | 0 |
| 0.8131944444444444 | 0 |
| 0.813888888888889 | 0 |
| 0.8145833333333333 | 0 |
| 0.8152777777777778 | 0 |
| 0.8159722222222222 | 0 |
| 0.8166666666666668 | 0 |
| 0.8173611111111111 | 0 |
| 0.8180555555555555 | 0 |
| 0.81875 | 0 |
| 0.8194444444444445 | 0 |
| 0.8201388888888889 | 0 |
| 0.8208333333333333 | 0 |
| 0.8215277777777777 | 0 |
| 0.8222222222222223 | 0 |
| 0.8229166666666666 | 0 |
| 0.8236111111111111 | 0 |
| 0.8243055555555556 | 0 |
| 0.8250000000000001 | 0 |
| 0.8256944444444444 | 0 |
| 0.8263888888888888 | 0 |
| 0.8270833333333334 | 0 |
| 0.8277777777777778 | 0 |
| 0.8284722222222222 | 0 |
| 0.8291666666666666 | 0 |
| 0.8298611111111112 | 0 |
| 0.8305555555555556 | 0 |
| 0.8312499999999999 | 0 |
| 0.8319444444444444 | 0 |
| 0.8326388888888889 | 0 |
| 0.8333333333333334 | 0 |
| 0.8340277777777777 | 0 |
| 0.8347222222222223 | 0 |
| 0.8354166666666667 | 0 |
| 0.8361111111111111 | 0 |
| 0.8368055555555555 | 0 |
| 0.8375 | 0 |
| 0.8381944444444445 | 0 |
| 0.8388888888888889 | 0 |
| 0.8395833333333332 | 0 |
| 0.8402777777777778 | 0 |
| 0.8409722222222222 | 0 |
| 0.8416666666666667 | 0 |
| 0.842361111111111 | 0 |
| 0.8430555555555556 | 0 |
| 0.84375 | 0 |
| 0.8444444444444444 | 0 |
| 0.845138888888889 | 0 |
| 0.8458333333333333 | 0 |
| 0.8465277777777778 | 0 |
| 0.8472222222222222 | 0 |
| 0.8479166666666668 | 0 |
| 0.8486111111111111 | 0 |
| 0.8493055555555555 | 0 |
| 0.85 | 0 |
| 0.8506944444444445 | 0 |
| 0.8513888888888889 | 0 |
| 0.8520833333333333 | 0 |
| 0.8527777777777777 | 0 |
| 0.8534722222222223 | 0 |
| 0.8541666666666666 | 0 |
| 0.8548611111111111 | 0 |
| 0.8555555555555556 | 0 |
| 0.8562500000000001 | 0 |
| 0.8569444444444444 | 0 |
| 0.8576388888888888 | 0 |
| 0.8583333333333334 | 0 |
| 0.8590277777777778 | 0 |
| 0.8597222222222222 | 0 |
| 0.8604166666666666 | 0 |
| 0.8611111111111112 | 0 |
| 0.8618055555555556 | 0 |
| 0.8624999999999999 | 0 |
| 0.8631944444444444 | 0 |
| 0.8638888888888889 | 0 |
| 0.8645833333333334 | 0 |
| 0.8652777777777777 | 0 |
| 0.8659722222222223 | 0 |
| 0.8666666666666667 | 0 |
| 0.8673611111111111 | 0 |
| 0.8680555555555555 | 0 |
| 0.86875 | 0 |
| 0.8694444444444445 | 0 |
| 0.8701388888888889 | 0 |
| 0.8708333333333332 | 0 |
| 0.8715277777777778 | 0 |
| 0.8722222222222222 | 0 |
| 0.8729166666666667 | 0 |
| 0.873611111111111 | 0 |
| 0.8743055555555556 | 0 |
| 0.875 | 0 |
| 0.8756944444444444 | 0 |
| 0.876388888888889 | 0 |
| 0.8770833333333333 | 0 |
| 0.8777777777777778 | 0 |
| 0.8784722222222222 | 0 |
| 0.8791666666666668 | 0 |
| 0.8798611111111111 | 0 |
| 0.8805555555555555 | 0 |
| 0.88125 | 0 |
| 0.8819444444444445 | 0 |
| 0.8826388888888889 | 0 |
| 0.8833333333333333 | 0 |
| 0.8840277777777777 | 0 |
| 0.8847222222222223 | 0 |
| 0.8854166666666666 | 0 |
| 0.8861111111111111 | 0 |
| 0.8868055555555556 | 0 |
| 0.8875000000000001 | 0 |
| 0.8881944444444444 | 0 |
| 0.8888888888888888 | 0 |
| 0.8895833333333334 | 0 |
| 0.8902777777777778 | 0 |
| 0.8909722222222222 | 0 |
| 0.8916666666666666 | 0 |
| 0.8923611111111112 | 0 |
| 0.8930555555555556 | 0 |
| 0.8937499999999999 | 0 |
| 0.8944444444444444 | 0 |
| 0.8951388888888889 | 0 |
| 0.8958333333333334 | 0 |
| 0.8965277777777777 | 0 |
| 0.8972222222222223 | 0 |
| 0.8979166666666667 | 0 |
| 0.8986111111111111 | 0 |
| 0.8993055555555555 | 0 |
| 0.9 | 0 |
| 0.9006944444444445 | 0 |
| 0.9013888888888889 | 0 |
| 0.9020833333333332 | 0 |
| 0.9027777777777778 | 0 |
| 0.9034722222222222 | 0 |
| 0.9041666666666667 | 0 |
| 0.904861111111111 | 0 |
| 0.9055555555555556 | 0 |
| 0.90625 | 0 |
| 0.9069444444444444 | 0 |
| 0.907638888888889 | 0 |
| 0.9083333333333333 | 0 |
| 0.9090277777777778 | 0 |
| 0.9097222222222222 | 0 |
| 0.9104166666666668 | 0 |
| 0.9111111111111111 | 0 |
| 0.9118055555555555 | 0 |
| 0.9125 | 0 |
| 0.9131944444444445 | 0 |
| 0.9138888888888889 | 0 |
| 0.9145833333333333 | 0 |
| 0.9152777777777777 | 0 |
| 0.9159722222222223 | 0 |
| 0.9166666666666666 | 0 |
| 0.9173611111111111 | 0 |
| 0.9180555555555556 | 0 |
| 0.9187500000000001 | 0 |
| 0.9194444444444444 | 0 |
| 0.9201388888888888 | 0 |
| 0.9208333333333334 | 0 |
| 0.9215277777777778 | 0 |
| 0.9222222222222222 | 0 |
| 0.9229166666666666 | 0 |
| 0.9236111111111112 | 0 |
| 0.9243055555555556 | 0 |
| 0.9249999999999999 | 0 |
| 0.9256944444444444 | 0 |
| 0.9263888888888889 | 0 |
| 0.9270833333333334 | 0 |
| 0.9277777777777777 | 0 |
| 0.9284722222222223 | 0 |
| 0.9291666666666667 | 0 |
| 0.9298611111111111 | 0 |
| 0.9305555555555555 | 0 |
| 0.93125 | 0 |
| 0.9319444444444445 | 0 |
| 0.9326388888888889 | 0 |
| 0.9333333333333332 | 0 |
| 0.9340277777777778 | 0 |
| 0.9347222222222222 | 0 |
| 0.9354166666666667 | 0 |
| 0.936111111111111 | 0 |
| 0.9368055555555556 | 0 |
| 0.9375 | 0 |
| 0.9381944444444444 | 0 |
| 0.938888888888889 | 0 |
| 0.9395833333333333 | 0 |
| 0.9402777777777778 | 0 |
| 0.9409722222222222 | 0 |
| 0.9416666666666668 | 0 |
| 0.9423611111111111 | 0 |
| 0.9430555555555555 | 0 |
| 0.94375 | 0 |
| 0.9444444444444445 | 0 |
| 0.9451388888888889 | 0 |
| 0.9458333333333333 | 0 |
| 0.9465277777777777 | 0 |
| 0.9472222222222223 | 0 |
| 0.9479166666666666 | 0 |
| 0.9486111111111111 | 0 |
| 0.9493055555555556 | 0 |
| 0.9500000000000001 | 0 |
| 0.9506944444444444 | 0 |
| 0.9513888888888888 | 0 |
| 0.9520833333333334 | 0 |
| 0.9527777777777778 | 0 |
| 0.9534722222222222 | 0 |
| 0.9541666666666666 | 0 |
| 0.9548611111111112 | 0 |
| 0.9555555555555556 | 0 |
| 0.9562499999999999 | 0 |
| 0.9569444444444444 | 0 |
| 0.9576388888888889 | 0 |
| 0.9583333333333334 | 0 |
| 0.9590277777777777 | 0 |
| 0.9597222222222223 | 0 |
| 0.9604166666666667 | 0 |
| 0.9611111111111111 | 0 |
| 0.9618055555555555 | 0 |
| 0.9625 | 0 |
| 0.9631944444444445 | 0 |
| 0.9638888888888889 | 0 |
| 0.9645833333333332 | 0 |
| 0.9652777777777778 | 0 |
| 0.9659722222222222 | 0 |
| 0.9666666666666667 | 0 |
| 0.967361111111111 | 0 |
| 0.9680555555555556 | 0 |
| 0.96875 | 0 |
| 0.9694444444444444 | 0 |
| 0.970138888888889 | 0 |
| 0.9708333333333333 | 0 |
| 0.9715277777777778 | 0 |
| 0.9722222222222222 | 0 |
| 0.9729166666666668 | 0 |
| 0.9736111111111111 | 0 |
| 0.9743055555555555 | 0 |
| 0.975 | 0 |
| 0.9756944444444445 | 0 |
| 0.9763888888888889 | 0 |
| 0.9770833333333333 | 0 |
| 0.9777777777777777 | 0 |
| 0.9784722222222223 | 0 |
| 0.9791666666666666 | 0 |
| 0.9798611111111111 | 0 |
| 0.9805555555555556 | 0 |
| 0.9812500000000001 | 0 |
| 0.9819444444444444 | 0 |
| 0.9826388888888888 | 0 |
| 0.9833333333333334 | 0 |
| 0.9840277777777778 | 0 |
| 0.9847222222222222 | 0 |
| 0.9854166666666666 | 0 |
| 0.9861111111111112 | 0 |
| 0.9868055555555556 | 0 |
| 0.9874999999999999 | 0 |
| 0.9881944444444444 | 0 |
| 0.9888888888888889 | 0 |
| 0.9895833333333334 | 0 |
| 0.9902777777777777 | 0 |
| 0.9909722222222223 | 0 |
| 0.9916666666666667 | 0 |
| 0.9923611111111111 | 0 |
| 0.9930555555555555 | 0 |
| 0.99375 | 0 |
| 0.9944444444444445 | 0 |
| 0.9951388888888889 | 0 |
| 0.9958333333333332 | 0 |
| 0.9965277777777778 | 0 |
| 0.9972222222222222 | 0 |
| 0.9979166666666667 | 0 |
| 0.998611111111111 | 0 |
| 0.9993055555555556 | 0 |